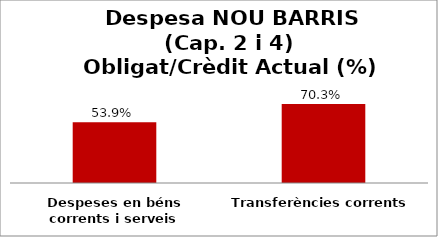
| Category | Series 0 |
|---|---|
| Despeses en béns corrents i serveis | 0.539 |
| Transferències corrents | 0.703 |